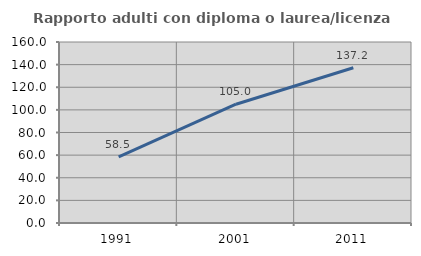
| Category | Rapporto adulti con diploma o laurea/licenza media  |
|---|---|
| 1991.0 | 58.511 |
| 2001.0 | 105.007 |
| 2011.0 | 137.246 |